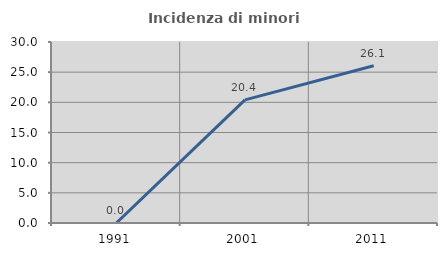
| Category | Incidenza di minori stranieri |
|---|---|
| 1991.0 | 0 |
| 2001.0 | 20.402 |
| 2011.0 | 26.058 |